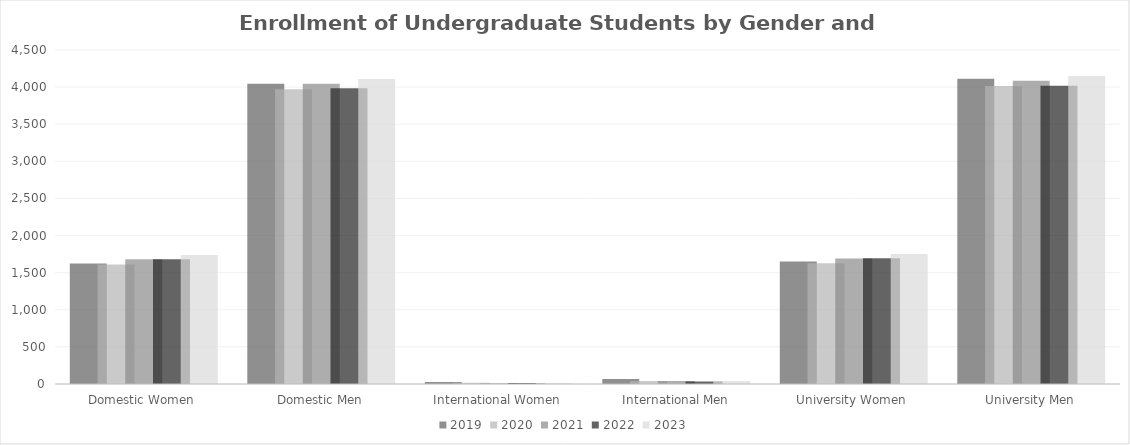
| Category | 2019 | 2020 | 2021 | 2022 | 2023 |
|---|---|---|---|---|---|
| Domestic Women | 1624 | 1611 | 1680 | 1680 | 1739 |
| Domestic Men | 4045 | 3972 | 4045 | 3984 | 4110 |
| International Women | 26 | 17 | 11 | 13 | 14 |
| International Men | 69 | 42 | 42 | 33 | 40 |
| University Women | 1650 | 1628 | 1691 | 1693 | 1753 |
| University Men | 4114 | 4014 | 4087 | 4017 | 4150 |